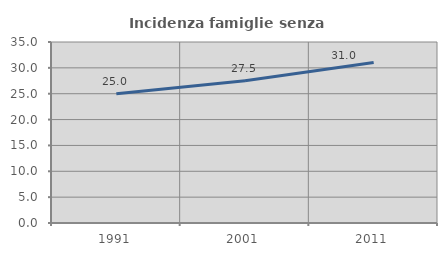
| Category | Incidenza famiglie senza nuclei |
|---|---|
| 1991.0 | 24.972 |
| 2001.0 | 27.49 |
| 2011.0 | 31.043 |